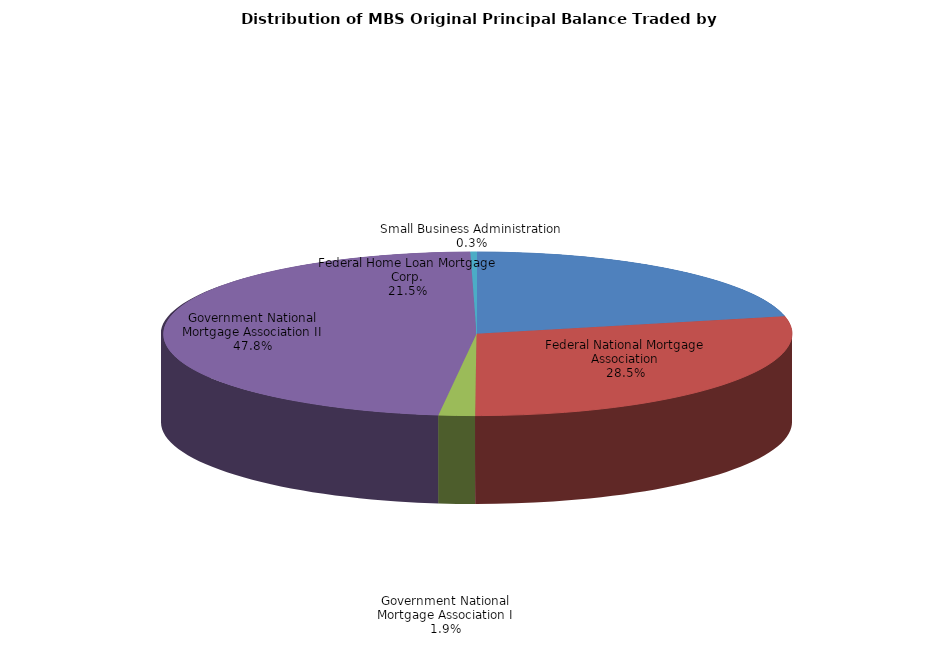
| Category | Series 0 |
|---|---|
| Federal Home Loan Mortgage Corp. | 3117214748.73 |
| Federal National Mortgage Association | 4129609711.256 |
| Government National Mortgage Association I | 268531026.392 |
| Government National Mortgage Association II | 6913567181.046 |
| Small Business Administration | 45138039.476 |